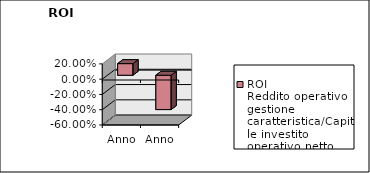
| Category | ROI
Reddito operativo gestione caratteristica/Capitale investito operativo netto |
|---|---|
| Anno 2023 | 0.152 |
| Anno 2022 | -0.449 |